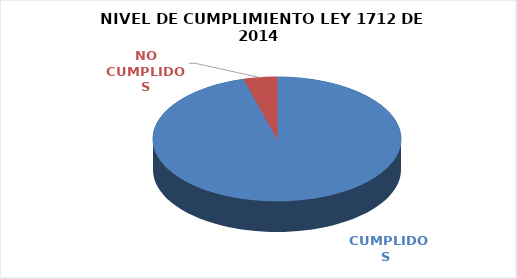
| Category | Series 0 |
|---|---|
|  CUMPLIDOS | 110 |
| NO CUMPLIDOS | 5 |